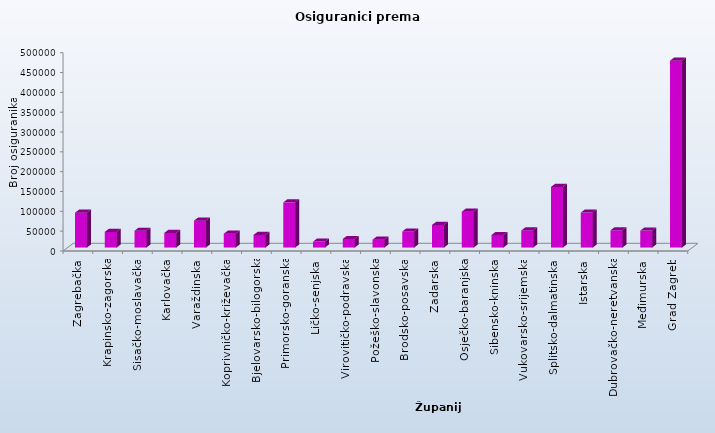
| Category | Series 0 |
|---|---|
| Zagrebačka | 87841 |
| Krapinsko-zagorska | 39436 |
| Sisačko-moslavačka | 42386 |
| Karlovačka | 36890 |
| Varaždinska | 67809 |
| Koprivničko-križevačka | 34926 |
| Bjelovarsko-bilogorska | 31737 |
| Primorsko-goranska | 113918 |
| Ličko-senjska | 15071 |
| Virovitičko-podravska | 21633 |
| Požeško-slavonska | 19833 |
| Brodsko-posavska | 40504 |
| Zadarska | 56956 |
| Osječko-baranjska | 90399 |
| Šibensko-kninska | 31668 |
| Vukovarsko-srijemska | 43178 |
| Splitsko-dalmatinska | 152863 |
| Istarska | 88210 |
| Dubrovačko-neretvanska | 43567 |
| Međimurska | 42782 |
| Grad Zagreb | 471269 |